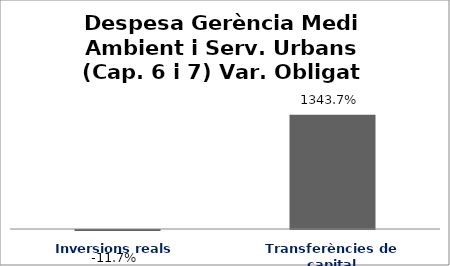
| Category | Series 0 |
|---|---|
| Inversions reals | -0.117 |
| Transferències de capital | 13.437 |